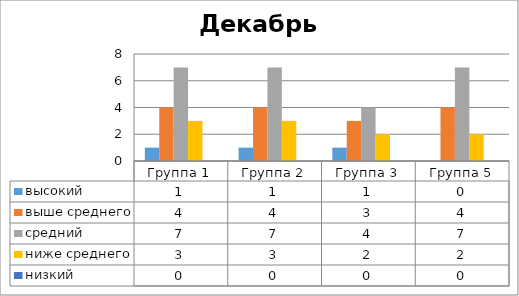
| Category | высокий | выше среднего | средний | ниже среднего | низкий |
|---|---|---|---|---|---|
| Группа 1 | 1 | 4 | 7 | 3 | 0 |
| Группа 2 | 1 | 4 | 7 | 3 | 0 |
| Группа 3 | 1 | 3 | 4 | 2 | 0 |
| Группа 5 | 0 | 4 | 7 | 2 | 0 |